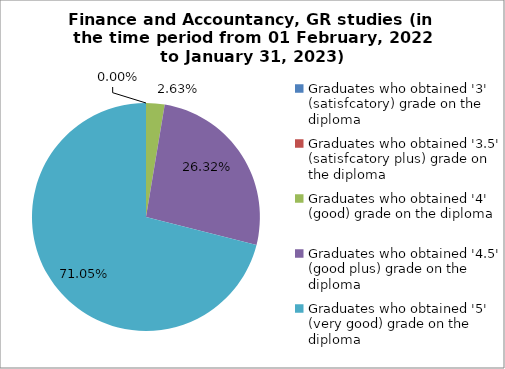
| Category | Series 0 |
|---|---|
| Graduates who obtained '3' (satisfcatory) grade on the diploma  | 0 |
| Graduates who obtained '3.5' (satisfcatory plus) grade on the diploma  | 0 |
| Graduates who obtained '4' (good) grade on the diploma  | 2.632 |
| Graduates who obtained '4.5' (good plus) grade on the diploma  | 26.316 |
| Graduates who obtained '5' (very good) grade on the diploma  | 71.053 |